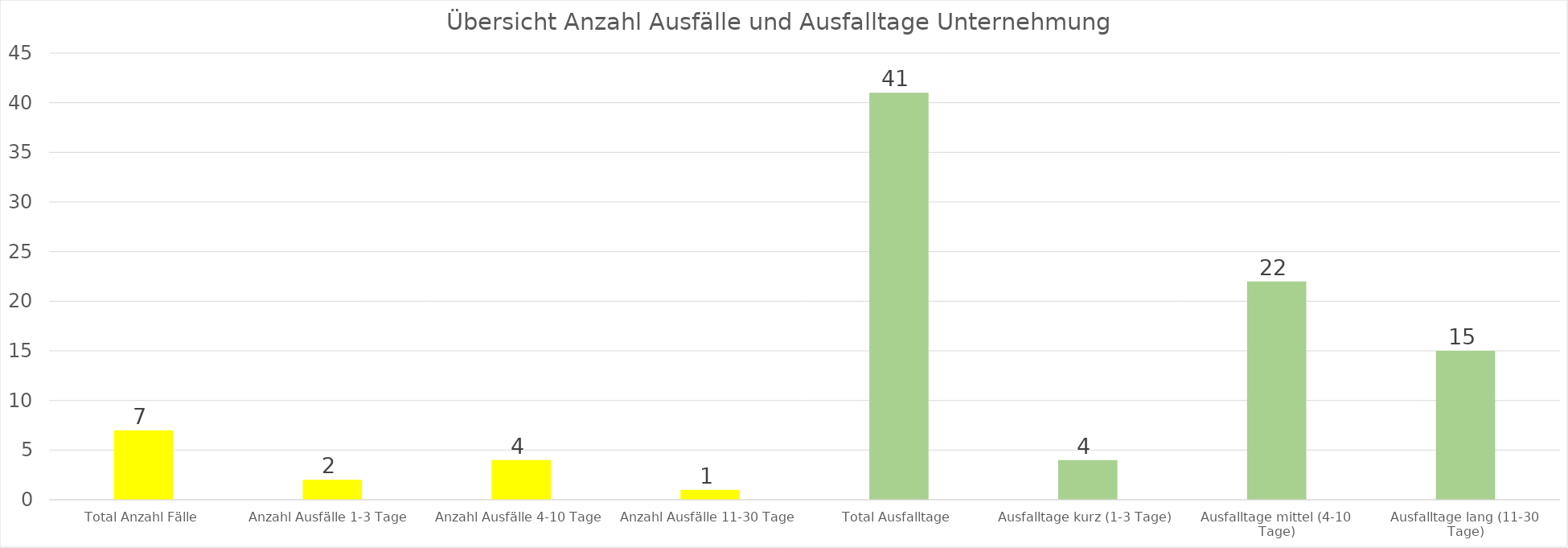
| Category | Gesamttotal |
|---|---|
| Total Anzahl Fälle | 7 |
| Anzahl Ausfälle 1-3 Tage  | 2 |
| Anzahl Ausfälle 4-10 Tage | 4 |
| Anzahl Ausfälle 11-30 Tage | 1 |
| Total Ausfalltage | 41 |
| Ausfalltage kurz (1-3 Tage) | 4 |
| Ausfalltage mittel (4-10 Tage) | 22 |
| Ausfalltage lang (11-30 Tage) | 15 |